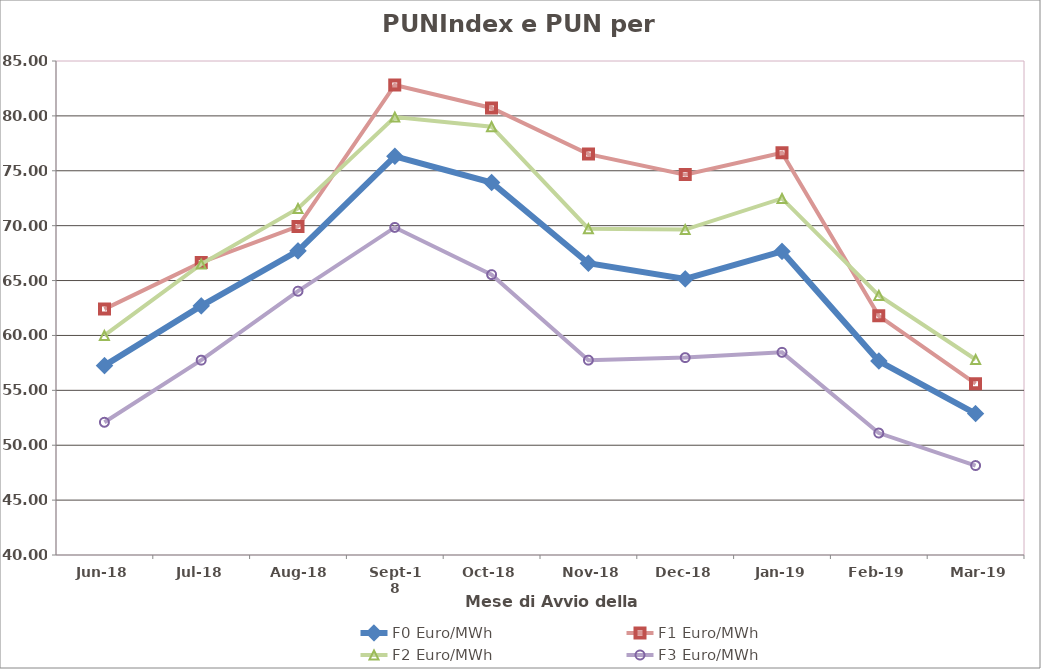
| Category | F0 | F1 | F2 | F3 |
|---|---|---|---|---|
| 2018-06-01 | 57.25 | 62.4 | 60 | 52.09 |
| 2018-07-01 | 62.69 | 66.65 | 66.5 | 57.75 |
| 2018-08-01 | 67.71 | 69.93 | 71.57 | 64.03 |
| 2018-09-01 | 76.32 | 82.82 | 79.89 | 69.84 |
| 2018-10-01 | 73.93 | 80.72 | 79.02 | 65.54 |
| 2018-11-01 | 66.58 | 76.52 | 69.72 | 57.75 |
| 2018-12-01 | 65.15 | 74.65 | 69.64 | 57.98 |
| 2019-01-01 | 67.65 | 76.64 | 72.48 | 58.46 |
| 2019-02-01 | 57.67 | 61.79 | 63.65 | 51.11 |
| 2019-03-01 | 52.88 | 55.61 | 57.81 | 48.15 |